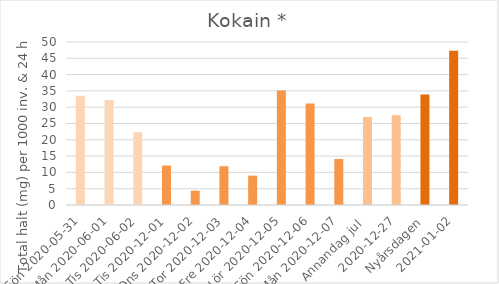
| Category | Kokain * |
|---|---|
| Sön 2020-05-31 | 33.5 |
| Mån 2020-06-01 | 32.2 |
|  Tis 2020-06-02 | 22.3 |
| Tis 2020-12-01 | 12.1 |
| Ons 2020-12-02 | 4.4 |
| Tor 2020-12-03 | 11.9 |
| Fre 2020-12-04 | 9 |
| Lör 2020-12-05 | 35.1 |
| Sön 2020-12-06 | 31.1 |
| Mån 2020-12-07 | 14.1 |
| Annandag jul  | 27 |
| 2020-12-27 | 27.5 |
| Nyårsdagen | 33.9 |
| 2021-01-02 | 47.3 |